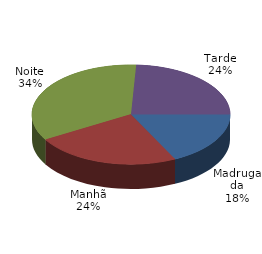
| Category | Qtde Vítimas |
|---|---|
| Madrugada | 305 |
| Manhã | 411 |
| Noite | 593 |
| Tarde | 417 |